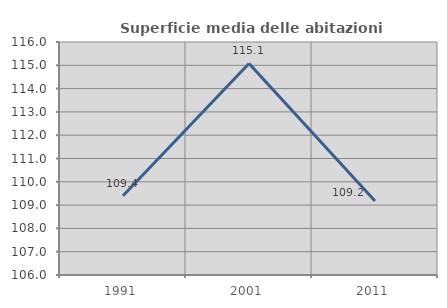
| Category | Superficie media delle abitazioni occupate |
|---|---|
| 1991.0 | 109.404 |
| 2001.0 | 115.077 |
| 2011.0 | 109.179 |